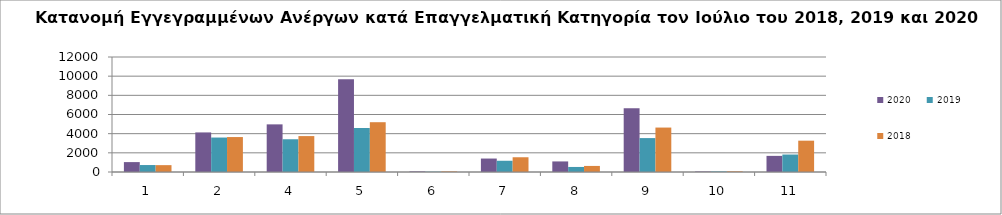
| Category | 2020 | 2019 | 2018 |
|---|---|---|---|
| 1.0 | 1033 | 727 | 716 |
| 2.0 | 4130 | 3596 | 3647 |
| 4.0 | 4971 | 3417 | 3748 |
| 5.0 | 9672 | 4589 | 5196 |
| 6.0 | 60 | 31 | 59 |
| 7.0 | 1404 | 1173 | 1539 |
| 8.0 | 1103 | 526 | 633 |
| 9.0 | 6642 | 3539 | 4637 |
| 10.0 | 53 | 57 | 68 |
| 11.0 | 1682 | 1823 | 3269 |